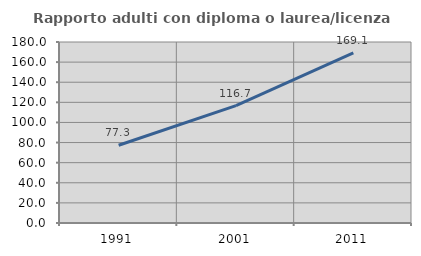
| Category | Rapporto adulti con diploma o laurea/licenza media  |
|---|---|
| 1991.0 | 77.302 |
| 2001.0 | 116.743 |
| 2011.0 | 169.072 |